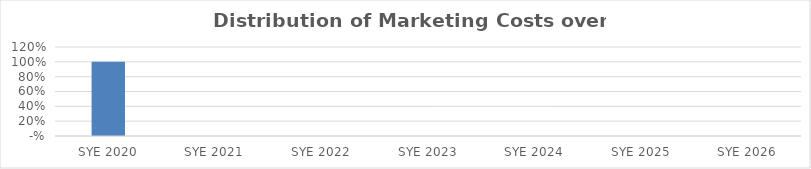
| Category | Series 0 |
|---|---|
| 2020.0 | 1 |
| 2021.0 | 0 |
| 2022.0 | 0 |
| 2023.0 | 0 |
| 2024.0 | 0 |
| 2025.0 | 0 |
| 2026.0 | 0 |